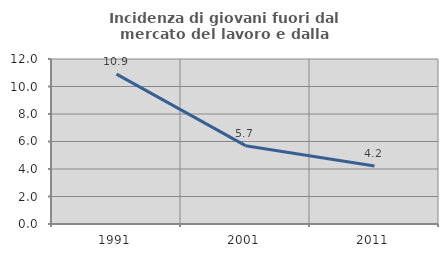
| Category | Incidenza di giovani fuori dal mercato del lavoro e dalla formazione  |
|---|---|
| 1991.0 | 10.901 |
| 2001.0 | 5.696 |
| 2011.0 | 4.223 |